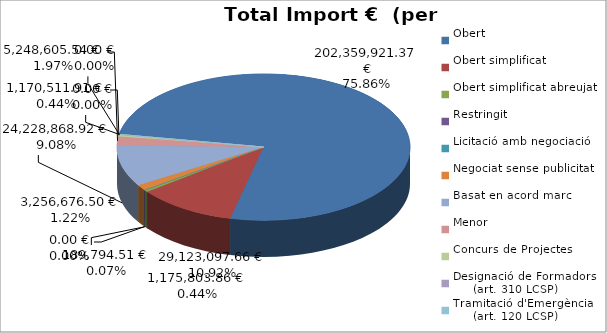
| Category | Total preu
(amb IVA) |
|---|---|
| Obert | 202359921.37 |
| Obert simplificat | 29123097.66 |
| Obert simplificat abreujat | 1175803.86 |
| Restringit | 189794.51 |
| Licitació amb negociació | 0 |
| Negociat sense publicitat | 3256676.5 |
| Basat en acord marc | 24228868.92 |
| Menor | 5248605.54 |
| Concurs de Projectes | 1170511.91 |
| Designació de Formadors
     (art. 310 LCSP) | 0 |
| Tramitació d'Emergència
     (art. 120 LCSP) | 0 |